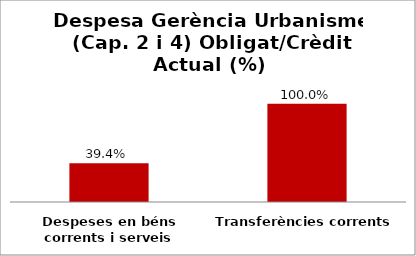
| Category | Series 0 |
|---|---|
| Despeses en béns corrents i serveis | 0.394 |
| Transferències corrents | 1 |